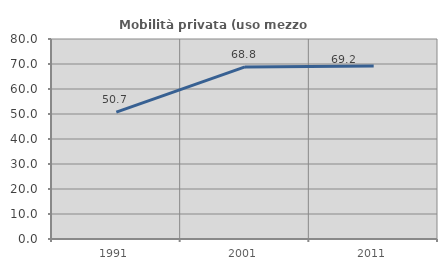
| Category | Mobilità privata (uso mezzo privato) |
|---|---|
| 1991.0 | 50.735 |
| 2001.0 | 68.837 |
| 2011.0 | 69.168 |